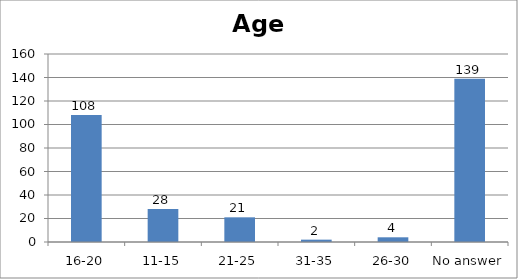
| Category | Age |
|---|---|
| 16-20 | 108 |
| 11-15 | 28 |
| 21-25 | 21 |
| 31-35 | 2 |
| 26-30 | 4 |
| No answer | 139 |